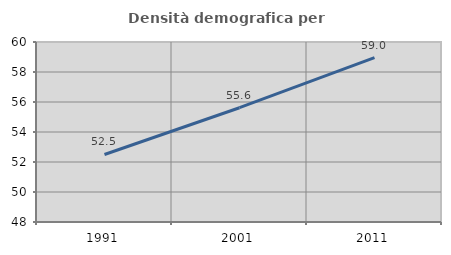
| Category | Densità demografica |
|---|---|
| 1991.0 | 52.503 |
| 2001.0 | 55.619 |
| 2011.0 | 58.964 |